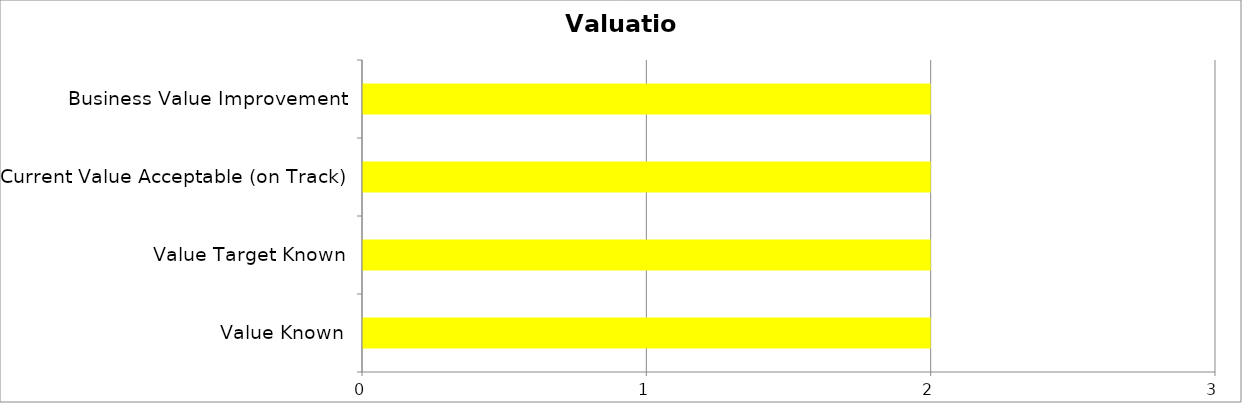
| Category | Series 0 | Series 1 | Series 2 |
|---|---|---|---|
| Value Known | 0 | 2 | 0 |
| Value Target Known | 0 | 2 | 0 |
| Current Value Acceptable (on Track) | 0 | 2 | 0 |
| Business Value Improvement | 0 | 2 | 0 |